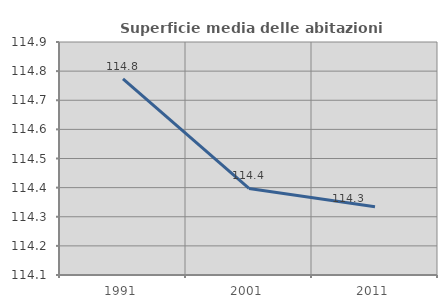
| Category | Superficie media delle abitazioni occupate |
|---|---|
| 1991.0 | 114.774 |
| 2001.0 | 114.397 |
| 2011.0 | 114.334 |